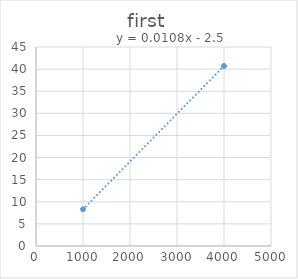
| Category | cm |
|---|---|
| 1000.0 | 8.3 |
| 4000.0 | 40.7 |